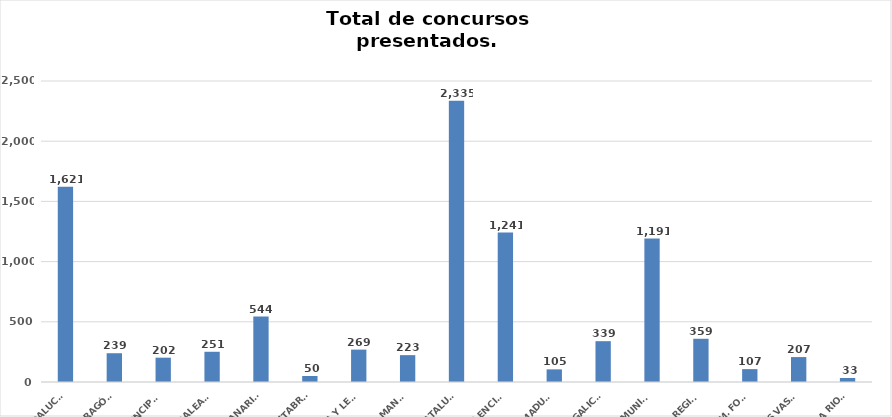
| Category | Series 0 |
|---|---|
| ANDALUCÍA | 1621 |
| ARAGÓN | 239 |
| ASTURIAS, PRINCIPADO | 202 |
| ILLES BALEARS | 251 |
| CANARIAS | 544 |
| CANTABRIA | 50 |
| CASTILLA Y LEÓN | 269 |
| CASTILLA - LA MANCHA | 223 |
| CATALUÑA | 2335 |
| COMUNITAT VALENCIANA | 1241 |
| EXTREMADURA | 105 |
| GALICIA | 339 |
| MADRID, COMUNIDAD | 1191 |
| MURCIA, REGIÓN | 359 |
| NAVARRA, COM. FORAL | 107 |
| PAÍS VASCO | 207 |
| LA RIOJA | 33 |